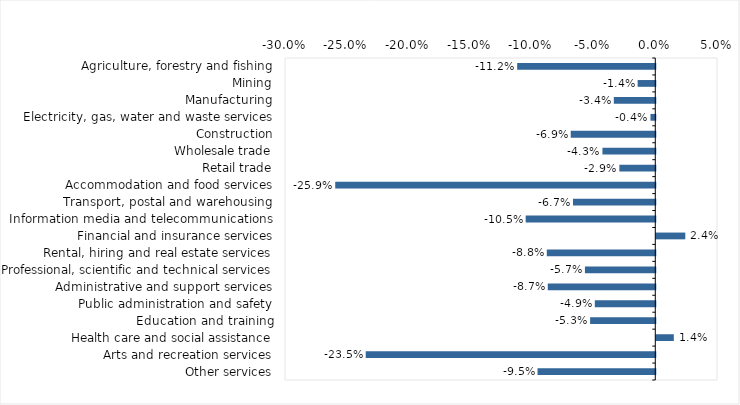
| Category | This week |
|---|---|
| Agriculture, forestry and fishing | -0.112 |
| Mining | -0.014 |
| Manufacturing | -0.034 |
| Electricity, gas, water and waste services | -0.004 |
| Construction | -0.068 |
| Wholesale trade | -0.043 |
| Retail trade | -0.029 |
| Accommodation and food services | -0.259 |
| Transport, postal and warehousing | -0.067 |
| Information media and telecommunications | -0.105 |
| Financial and insurance services | 0.024 |
| Rental, hiring and real estate services | -0.088 |
| Professional, scientific and technical services | -0.057 |
| Administrative and support services | -0.087 |
| Public administration and safety | -0.049 |
| Education and training | -0.053 |
| Health care and social assistance | 0.014 |
| Arts and recreation services | -0.235 |
| Other services | -0.095 |